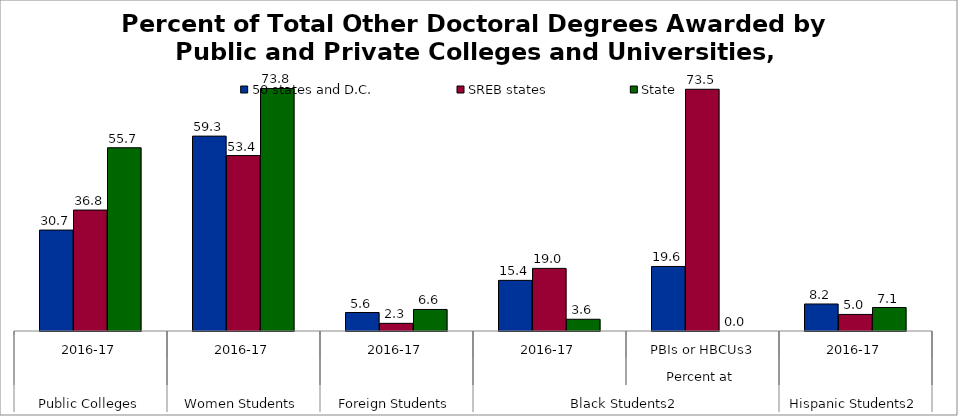
| Category | 50 states and D.C. | SREB states | State |
|---|---|---|---|
| 0 | 30.701 | 36.788 | 55.738 |
| 1 | 59.279 | 53.368 | 73.77 |
| 2 | 5.627 | 2.332 | 6.557 |
| 3 | 15.402 | 19.048 | 3.571 |
| 4 | 19.63 | 73.529 | 0 |
| 5 | 8.214 | 5.042 | 7.143 |